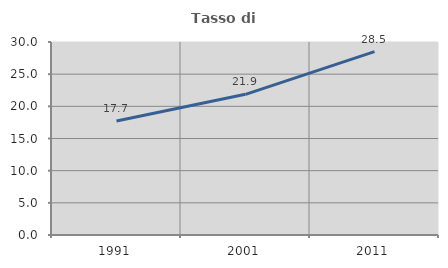
| Category | Tasso di occupazione   |
|---|---|
| 1991.0 | 17.734 |
| 2001.0 | 21.869 |
| 2011.0 | 28.509 |